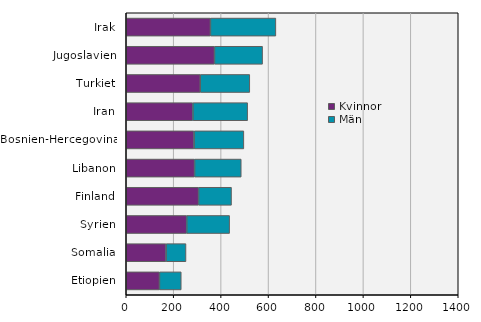
| Category | Kvinnor | Män |
|---|---|---|
| Etiopien | 140 | 92 |
| Somalia | 168 | 84 |
| Syrien | 255 | 181 |
| Finland | 305 | 139 |
| Libanon | 288 | 197 |
| Bosnien-Hercegovina | 286 | 210 |
| Iran | 281 | 231 |
| Turkiet | 312 | 209 |
| Jugoslavien | 372 | 203 |
| Irak | 355 | 276 |